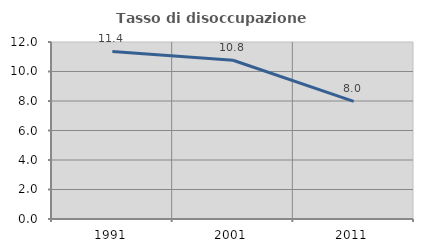
| Category | Tasso di disoccupazione giovanile  |
|---|---|
| 1991.0 | 11.364 |
| 2001.0 | 10.762 |
| 2011.0 | 7.969 |